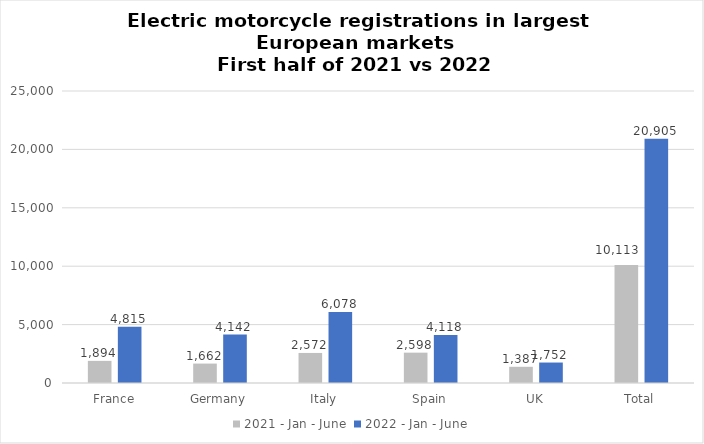
| Category | 2021 - Jan - June | 2022 - Jan - June |
|---|---|---|
| France | 1894 | 4815 |
| Germany | 1662 | 4142 |
| Italy | 2572 | 6078 |
| Spain | 2598 | 4118 |
| UK | 1387 | 1752 |
| Total | 10113 | 20905 |